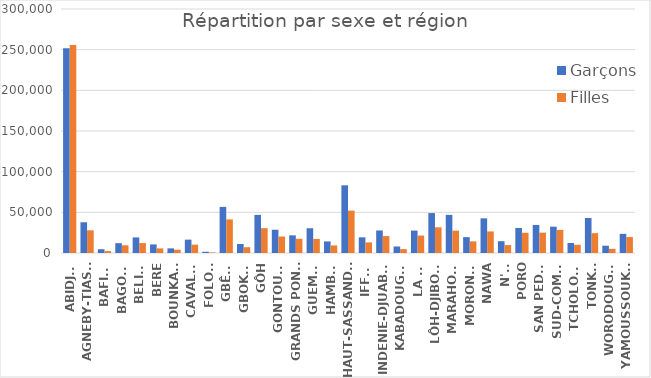
| Category | Garçons | Filles |
|---|---|---|
| ABIDJAN | 251704 | 255782 |
| AGNEBY-TIASSA | 37809 | 27913 |
| BAFING | 4654 | 2346 |
| BAGOUE | 12080 | 9468 |
| BELIER | 19149 | 12198 |
| BERE | 10554 | 5681 |
| BOUNKANI | 5690 | 4017 |
| CAVALLY | 16411 | 10299 |
| FOLON | 1517 | 662 |
| GBÊKÊ | 56676 | 41293 |
| GBOKLE | 11049 | 7119 |
| GÔH | 46845 | 30536 |
| GONTOUGO | 28612 | 20282 |
| GRANDS PONTS | 21694 | 17440 |
| GUEMON | 30438 | 17299 |
| HAMBOL | 14238 | 9301 |
| HAUT-SASSANDRA | 83225 | 52088 |
| IFFOU | 19265 | 13021 |
| INDENIE-DJUABLIN | 27680 | 20783 |
| KABADOUGOU | 7997 | 4743 |
| LA ME | 27572 | 21409 |
| LÔH-DJIBOUA | 49097 | 31613 |
| MARAHOUE | 46864 | 27419 |
| MORONOU | 19506 | 14277 |
| NAWA | 42615 | 26542 |
| N'ZI | 14508 | 9768 |
| PORO | 30816 | 24879 |
| SAN PEDRO | 34402 | 25010 |
| SUD-COMOE | 32367 | 28419 |
| TCHOLOGO | 12319 | 10098 |
| TONKPI | 43063 | 24408 |
| WORODOUGOU | 8971 | 5130 |
| YAMOUSSOUKRO | 23523 | 19610 |